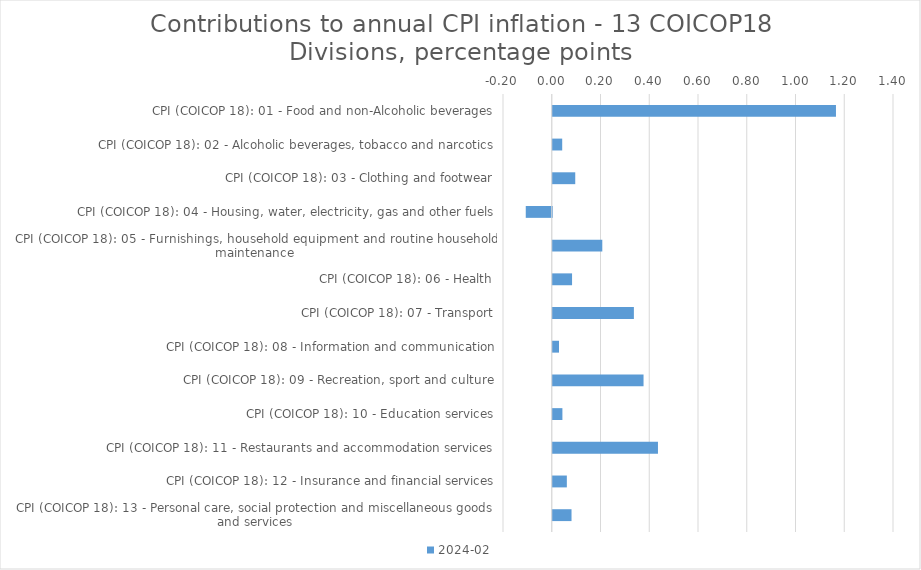
| Category | 2024-02 |
|---|---|
| CPI (COICOP 18): 01 - Food and non-Alcoholic beverages | 1.162 |
| CPI (COICOP 18): 02 - Alcoholic beverages, tobacco and narcotics | 0.039 |
| CPI (COICOP 18): 03 - Clothing and footwear | 0.092 |
| CPI (COICOP 18): 04 - Housing, water, electricity, gas and other fuels | -0.107 |
| CPI (COICOP 18): 05 - Furnishings, household equipment and routine household maintenance | 0.203 |
| CPI (COICOP 18): 06 - Health | 0.079 |
| CPI (COICOP 18): 07 - Transport | 0.333 |
| CPI (COICOP 18): 08 - Information and communication | 0.026 |
| CPI (COICOP 18): 09 - Recreation, sport and culture | 0.372 |
| CPI (COICOP 18): 10 - Education services | 0.04 |
| CPI (COICOP 18): 11 - Restaurants and accommodation services | 0.432 |
| CPI (COICOP 18): 12 - Insurance and financial services | 0.058 |
| CPI (COICOP 18): 13 - Personal care, social protection and miscellaneous goods and services | 0.077 |